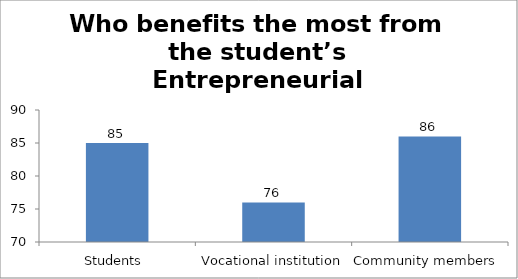
| Category | Who benefits the most from the student’s Entrepreneurial projects/activities? |
|---|---|
| Students  | 85 |
| Vocational institution | 76 |
| Community members  | 86 |